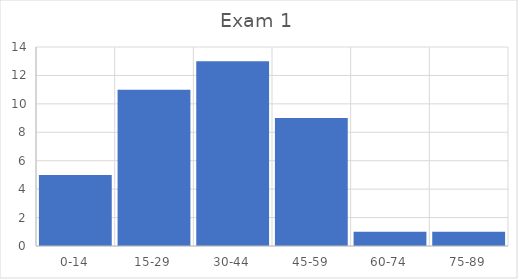
| Category | Series 0 |
|---|---|
| 0-14 | 5 |
| 15-29 | 11 |
| 30-44 | 13 |
| 45-59 | 9 |
| 60-74 | 1 |
| 75-89 | 1 |